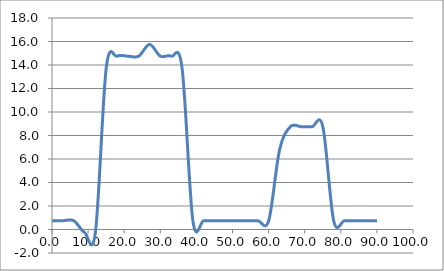
| Category | Elevation (in.) |
|---|---|
| 0.024 | 0.75 |
| 3.024 | 0.75 |
| 6.024 | 0.75 |
| 9.024000000000001 | -0.25 |
| 12.024000000000001 | -0.25 |
| 15.024000000000001 | 13.75 |
| 18.024 | 14.75 |
| 21.024 | 14.75 |
| 24.023999999999997 | 14.75 |
| 27.023999999999997 | 15.75 |
| 30.023999999999997 | 14.75 |
| 33.024 | 14.75 |
| 36.024 | 13.75 |
| 39.024 | 0.75 |
| 42.024 | 0.75 |
| 45.024 | 0.75 |
| 48.024 | 0.75 |
| 51.024 | 0.75 |
| 54.024 | 0.75 |
| 57.024 | 0.75 |
| 60.024 | 0.75 |
| 63.024 | 6.75 |
| 66.024 | 8.75 |
| 69.024 | 8.75 |
| 72.024 | 8.75 |
| 75.024 | 8.75 |
| 78.024 | 0.75 |
| 81.024 | 0.75 |
| 84.024 | 0.75 |
| 87.024 | 0.75 |
| 90.024 | 0.75 |